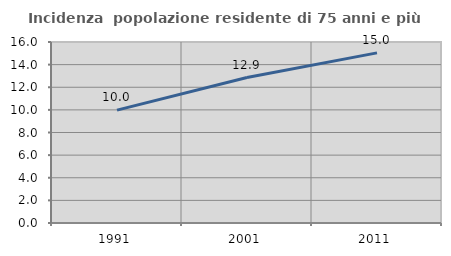
| Category | Incidenza  popolazione residente di 75 anni e più |
|---|---|
| 1991.0 | 9.975 |
| 2001.0 | 12.857 |
| 2011.0 | 15.038 |